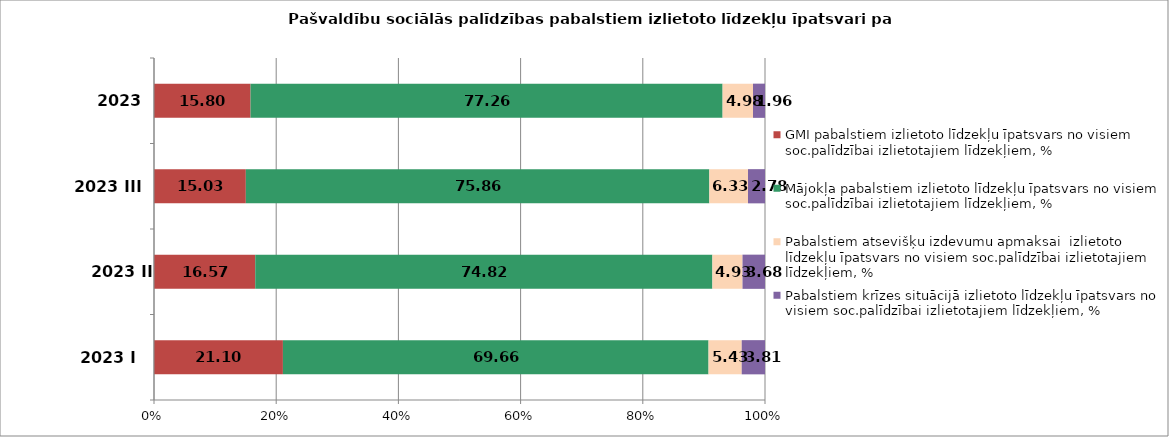
| Category | GMI pabalstiem izlietoto līdzekļu īpatsvars no visiem soc.palīdzībai izlietotajiem līdzekļiem, % | Mājokļa pabalstiem izlietoto līdzekļu īpatsvars no visiem soc.palīdzībai izlietotajiem līdzekļiem, % | Pabalstiem atsevišķu izdevumu apmaksai  izlietoto līdzekļu īpatsvars no visiem soc.palīdzībai izlietotajiem līdzekļiem, % | Pabalstiem krīzes situācijā izlietoto līdzekļu īpatsvars no visiem soc.palīdzībai izlietotajiem līdzekļiem, % |
|---|---|---|---|---|
| 2023 I | 21.1 | 69.66 | 5.43 | 3.81 |
| 2023 II | 16.57 | 74.82 | 4.93 | 3.68 |
| 2023 III | 15.03 | 75.86 | 6.33 | 2.78 |
| 2023 IV | 15.8 | 77.26 | 4.98 | 1.96 |